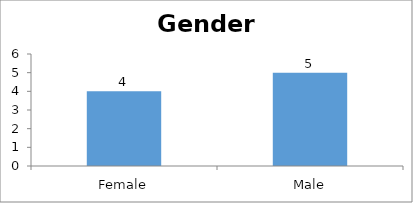
| Category | Gender |
|---|---|
| Female | 4 |
| Male | 5 |